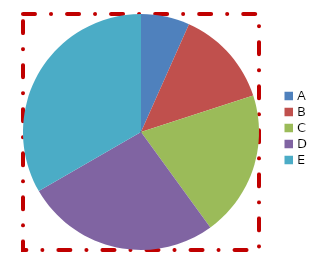
| Category | Series 0 | Series 1 | Series 2 | Series 3 |
|---|---|---|---|---|
| A | 1 | 10 | 5 | 11 |
| B | 2 | 9 | 4 | 12 |
| C | 3 | 8 | 3 | 2 |
| D | 4 | 7 | 2 | 9 |
| E | 5 | 6 | 9 | 31 |